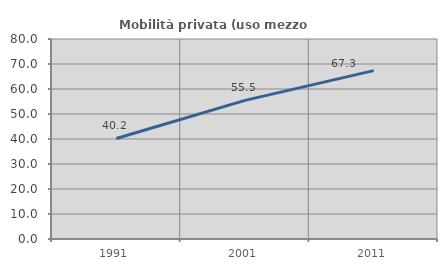
| Category | Mobilità privata (uso mezzo privato) |
|---|---|
| 1991.0 | 40.222 |
| 2001.0 | 55.452 |
| 2011.0 | 67.34 |